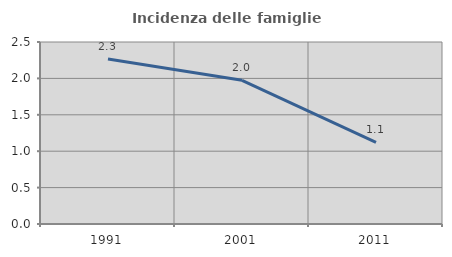
| Category | Incidenza delle famiglie numerose |
|---|---|
| 1991.0 | 2.268 |
| 2001.0 | 1.974 |
| 2011.0 | 1.121 |